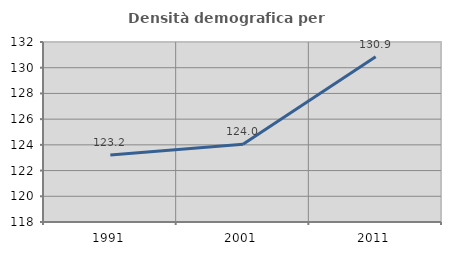
| Category | Densità demografica |
|---|---|
| 1991.0 | 123.212 |
| 2001.0 | 124.039 |
| 2011.0 | 130.861 |